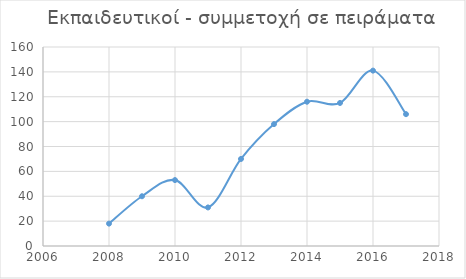
| Category | Πειράματα |
|---|---|
| 2008.0 | 18 |
| 2009.0 | 40 |
| 2010.0 | 53 |
| 2011.0 | 31 |
| 2012.0 | 70 |
| 2013.0 | 98 |
| 2014.0 | 116 |
| 2015.0 | 115 |
| 2016.0 | 141 |
| 2017.0 | 106 |